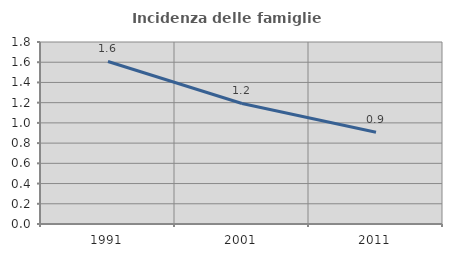
| Category | Incidenza delle famiglie numerose |
|---|---|
| 1991.0 | 1.607 |
| 2001.0 | 1.192 |
| 2011.0 | 0.907 |